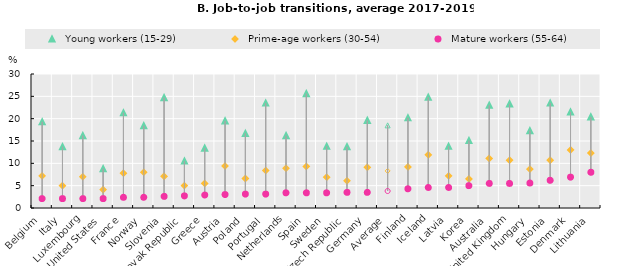
| Category |   Young workers (15-29) |   Prime-age workers (30-54) |   Mature workers (55-64) |
|---|---|---|---|
| Belgium | 19.3 | 7.2 | 2.1 |
| Italy | 13.7 | 5 | 2.1 |
| Luxembourg | 16.2 | 7 | 2.1 |
| United States | 8.8 | 4.1 | 2.1 |
| France | 21.3 | 7.8 | 2.4 |
| Norway | 18.4 | 8 | 2.4 |
| Slovenia | 24.7 | 7.1 | 2.6 |
| Slovak Republic | 10.5 | 5 | 2.7 |
| Greece | 13.4 | 5.5 | 2.9 |
| Austria | 19.5 | 9.4 | 3 |
| Poland | 16.7 | 6.6 | 3.1 |
| Portugal | 23.5 | 8.4 | 3.1 |
| Netherlands | 16.2 | 8.9 | 3.4 |
| Spain | 25.6 | 9.3 | 3.4 |
| Sweden | 13.8 | 6.9 | 3.4 |
| Czech Republic | 13.7 | 6.1 | 3.5 |
| Germany | 19.6 | 9.1 | 3.5 |
| Average | 18.5 | 8.3 | 3.8 |
| Finland | 20.2 | 9.2 | 4.3 |
| Iceland | 24.8 | 11.9 | 4.6 |
| Latvia | 13.8 | 7.2 | 4.6 |
| Korea | 15.1 | 6.5 | 5 |
| Australia | 23 | 11.1 | 5.5 |
| United Kingdom | 23.3 | 10.7 | 5.5 |
| Hungary | 17.3 | 8.7 | 5.6 |
| Estonia | 23.5 | 10.7 | 6.2 |
| Denmark | 21.5 | 13 | 6.9 |
| Lithuania | 20.4 | 12.3 | 8 |